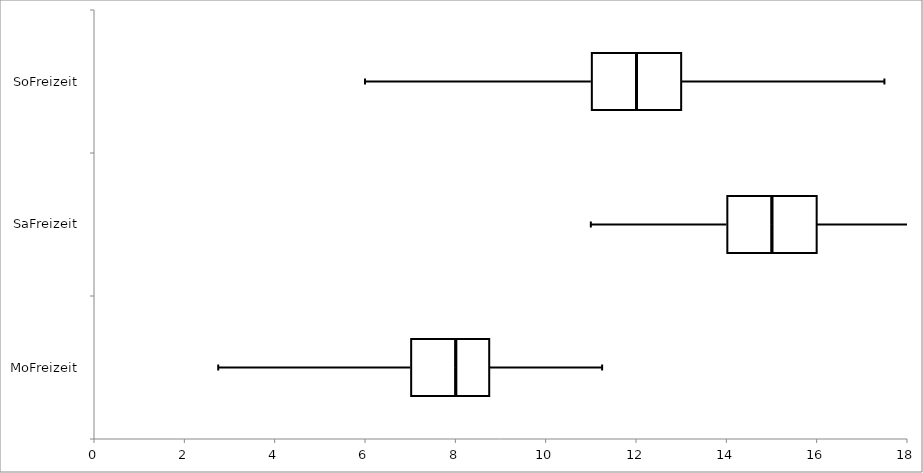
| Category | Series 0 | Series 1 | Series 2 |
|---|---|---|---|
| MoFreizeit | 7 | 1 | 0.75 |
| SaFreizeit | 14 | 1 | 1 |
| SoFreizeit | 11 | 1 | 1 |